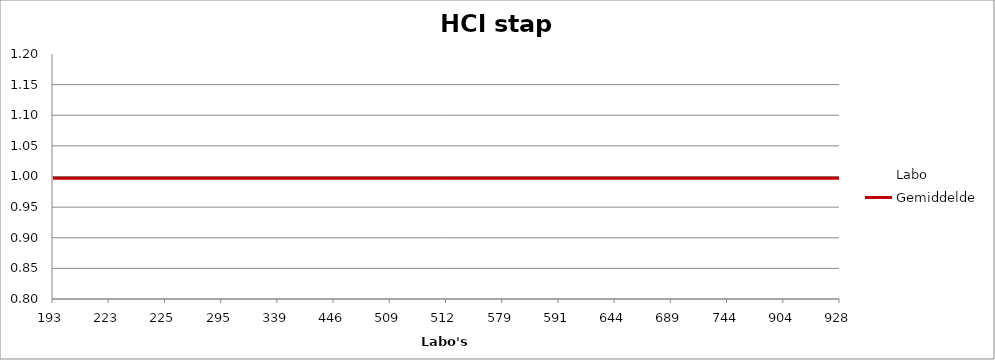
| Category | Labo | Gemiddelde |
|---|---|---|
| 193.0 | 0.996 | 0.997 |
| 223.0 | 1.031 | 0.997 |
| 225.0 | 0.978 | 0.997 |
| 295.0 | 0.993 | 0.997 |
| 339.0 | 0.951 | 0.997 |
| 446.0 | 1.077 | 0.997 |
| 509.0 | 1 | 0.997 |
| 512.0 | 1.026 | 0.997 |
| 579.0 | 0.986 | 0.997 |
| 591.0 | 0.919 | 0.997 |
| 644.0 | 0.991 | 0.997 |
| 689.0 | 1.005 | 0.997 |
| 744.0 | 0.97 | 0.997 |
| 904.0 | 1.074 | 0.997 |
| 928.0 | 0.991 | 0.997 |